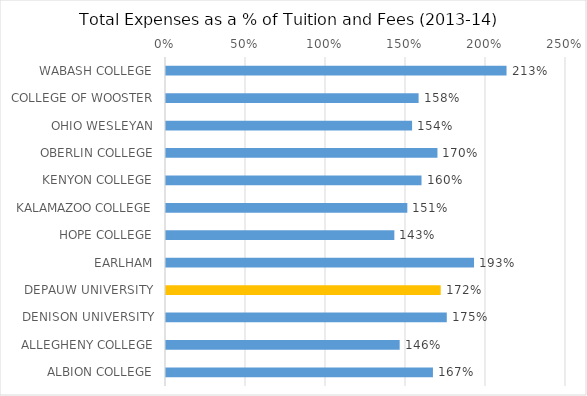
| Category | Series 0 |
|---|---|
| WABASH COLLEGE | 2.128 |
| COLLEGE OF WOOSTER | 1.579 |
| OHIO WESLEYAN | 1.538 |
| OBERLIN COLLEGE | 1.697 |
| KENYON COLLEGE | 1.597 |
| KALAMAZOO COLLEGE | 1.508 |
| HOPE COLLEGE | 1.427 |
| EARLHAM | 1.925 |
| DEPAUW UNIVERSITY | 1.717 |
| DENISON UNIVERSITY | 1.755 |
| ALLEGHENY COLLEGE | 1.46 |
| ALBION COLLEGE | 1.668 |